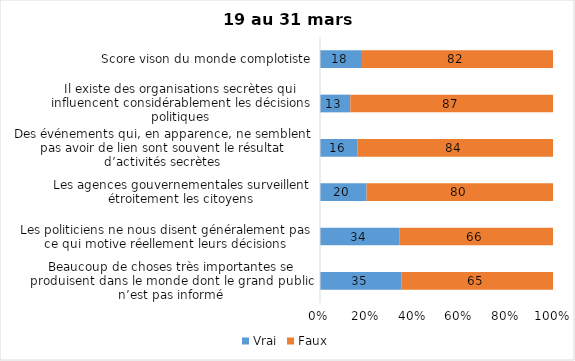
| Category | Vrai | Faux |
|---|---|---|
| Beaucoup de choses très importantes se produisent dans le monde dont le grand public n’est pas informé | 35 | 65 |
| Les politiciens ne nous disent généralement pas ce qui motive réellement leurs décisions | 34 | 66 |
| Les agences gouvernementales surveillent étroitement les citoyens | 20 | 80 |
| Des événements qui, en apparence, ne semblent pas avoir de lien sont souvent le résultat d’activités secrètes | 16 | 84 |
| Il existe des organisations secrètes qui influencent considérablement les décisions politiques | 13 | 87 |
| Score vison du monde complotiste | 18 | 82 |